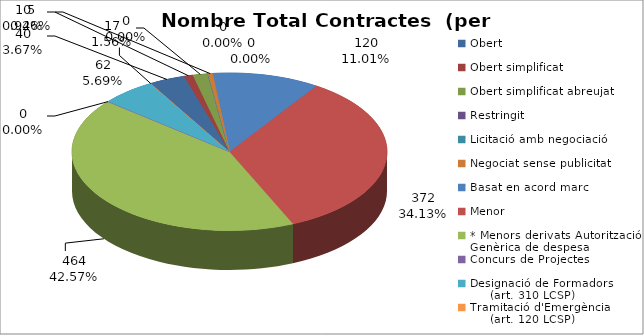
| Category | Nombre Total Contractes |
|---|---|
| Obert | 40 |
| Obert simplificat | 10 |
| Obert simplificat abreujat | 17 |
| Restringit | 0 |
| Licitació amb negociació | 0 |
| Negociat sense publicitat | 5 |
| Basat en acord marc | 120 |
| Menor | 372 |
| * Menors derivats Autorització Genèrica de despesa | 464 |
| Concurs de Projectes | 0 |
| Designació de Formadors
     (art. 310 LCSP) | 62 |
| Tramitació d'Emergència
     (art. 120 LCSP) | 0 |